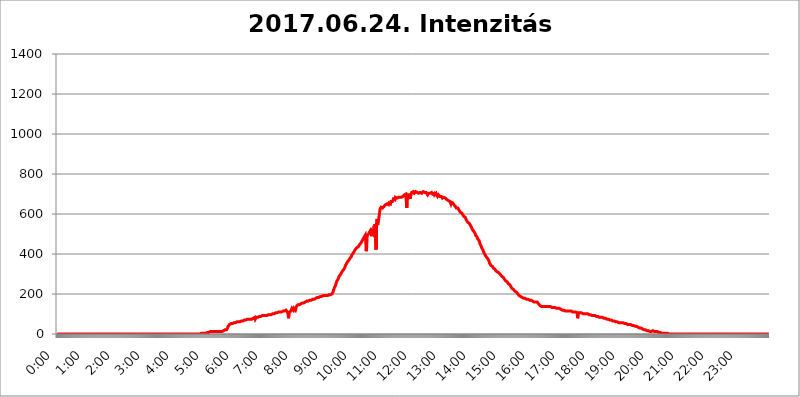
| Category | 2017.06.24. Intenzitás [W/m^2] |
|---|---|
| 0.0 | 0 |
| 0.0006944444444444445 | 0 |
| 0.001388888888888889 | 0 |
| 0.0020833333333333333 | 0 |
| 0.002777777777777778 | 0 |
| 0.003472222222222222 | 0 |
| 0.004166666666666667 | 0 |
| 0.004861111111111111 | 0 |
| 0.005555555555555556 | 0 |
| 0.0062499999999999995 | 0 |
| 0.006944444444444444 | 0 |
| 0.007638888888888889 | 0 |
| 0.008333333333333333 | 0 |
| 0.009027777777777779 | 0 |
| 0.009722222222222222 | 0 |
| 0.010416666666666666 | 0 |
| 0.011111111111111112 | 0 |
| 0.011805555555555555 | 0 |
| 0.012499999999999999 | 0 |
| 0.013194444444444444 | 0 |
| 0.013888888888888888 | 0 |
| 0.014583333333333332 | 0 |
| 0.015277777777777777 | 0 |
| 0.015972222222222224 | 0 |
| 0.016666666666666666 | 0 |
| 0.017361111111111112 | 0 |
| 0.018055555555555557 | 0 |
| 0.01875 | 0 |
| 0.019444444444444445 | 0 |
| 0.02013888888888889 | 0 |
| 0.020833333333333332 | 0 |
| 0.02152777777777778 | 0 |
| 0.022222222222222223 | 0 |
| 0.02291666666666667 | 0 |
| 0.02361111111111111 | 0 |
| 0.024305555555555556 | 0 |
| 0.024999999999999998 | 0 |
| 0.025694444444444447 | 0 |
| 0.02638888888888889 | 0 |
| 0.027083333333333334 | 0 |
| 0.027777777777777776 | 0 |
| 0.02847222222222222 | 0 |
| 0.029166666666666664 | 0 |
| 0.029861111111111113 | 0 |
| 0.030555555555555555 | 0 |
| 0.03125 | 0 |
| 0.03194444444444445 | 0 |
| 0.03263888888888889 | 0 |
| 0.03333333333333333 | 0 |
| 0.034027777777777775 | 0 |
| 0.034722222222222224 | 0 |
| 0.035416666666666666 | 0 |
| 0.036111111111111115 | 0 |
| 0.03680555555555556 | 0 |
| 0.0375 | 0 |
| 0.03819444444444444 | 0 |
| 0.03888888888888889 | 0 |
| 0.03958333333333333 | 0 |
| 0.04027777777777778 | 0 |
| 0.04097222222222222 | 0 |
| 0.041666666666666664 | 0 |
| 0.042361111111111106 | 0 |
| 0.04305555555555556 | 0 |
| 0.043750000000000004 | 0 |
| 0.044444444444444446 | 0 |
| 0.04513888888888889 | 0 |
| 0.04583333333333334 | 0 |
| 0.04652777777777778 | 0 |
| 0.04722222222222222 | 0 |
| 0.04791666666666666 | 0 |
| 0.04861111111111111 | 0 |
| 0.049305555555555554 | 0 |
| 0.049999999999999996 | 0 |
| 0.05069444444444445 | 0 |
| 0.051388888888888894 | 0 |
| 0.052083333333333336 | 0 |
| 0.05277777777777778 | 0 |
| 0.05347222222222222 | 0 |
| 0.05416666666666667 | 0 |
| 0.05486111111111111 | 0 |
| 0.05555555555555555 | 0 |
| 0.05625 | 0 |
| 0.05694444444444444 | 0 |
| 0.057638888888888885 | 0 |
| 0.05833333333333333 | 0 |
| 0.05902777777777778 | 0 |
| 0.059722222222222225 | 0 |
| 0.06041666666666667 | 0 |
| 0.061111111111111116 | 0 |
| 0.06180555555555556 | 0 |
| 0.0625 | 0 |
| 0.06319444444444444 | 0 |
| 0.06388888888888888 | 0 |
| 0.06458333333333334 | 0 |
| 0.06527777777777778 | 0 |
| 0.06597222222222222 | 0 |
| 0.06666666666666667 | 0 |
| 0.06736111111111111 | 0 |
| 0.06805555555555555 | 0 |
| 0.06874999999999999 | 0 |
| 0.06944444444444443 | 0 |
| 0.07013888888888889 | 0 |
| 0.07083333333333333 | 0 |
| 0.07152777777777779 | 0 |
| 0.07222222222222223 | 0 |
| 0.07291666666666667 | 0 |
| 0.07361111111111111 | 0 |
| 0.07430555555555556 | 0 |
| 0.075 | 0 |
| 0.07569444444444444 | 0 |
| 0.0763888888888889 | 0 |
| 0.07708333333333334 | 0 |
| 0.07777777777777778 | 0 |
| 0.07847222222222222 | 0 |
| 0.07916666666666666 | 0 |
| 0.0798611111111111 | 0 |
| 0.08055555555555556 | 0 |
| 0.08125 | 0 |
| 0.08194444444444444 | 0 |
| 0.08263888888888889 | 0 |
| 0.08333333333333333 | 0 |
| 0.08402777777777777 | 0 |
| 0.08472222222222221 | 0 |
| 0.08541666666666665 | 0 |
| 0.08611111111111112 | 0 |
| 0.08680555555555557 | 0 |
| 0.08750000000000001 | 0 |
| 0.08819444444444445 | 0 |
| 0.08888888888888889 | 0 |
| 0.08958333333333333 | 0 |
| 0.09027777777777778 | 0 |
| 0.09097222222222222 | 0 |
| 0.09166666666666667 | 0 |
| 0.09236111111111112 | 0 |
| 0.09305555555555556 | 0 |
| 0.09375 | 0 |
| 0.09444444444444444 | 0 |
| 0.09513888888888888 | 0 |
| 0.09583333333333333 | 0 |
| 0.09652777777777777 | 0 |
| 0.09722222222222222 | 0 |
| 0.09791666666666667 | 0 |
| 0.09861111111111111 | 0 |
| 0.09930555555555555 | 0 |
| 0.09999999999999999 | 0 |
| 0.10069444444444443 | 0 |
| 0.1013888888888889 | 0 |
| 0.10208333333333335 | 0 |
| 0.10277777777777779 | 0 |
| 0.10347222222222223 | 0 |
| 0.10416666666666667 | 0 |
| 0.10486111111111111 | 0 |
| 0.10555555555555556 | 0 |
| 0.10625 | 0 |
| 0.10694444444444444 | 0 |
| 0.1076388888888889 | 0 |
| 0.10833333333333334 | 0 |
| 0.10902777777777778 | 0 |
| 0.10972222222222222 | 0 |
| 0.1111111111111111 | 0 |
| 0.11180555555555556 | 0 |
| 0.11180555555555556 | 0 |
| 0.1125 | 0 |
| 0.11319444444444444 | 0 |
| 0.11388888888888889 | 0 |
| 0.11458333333333333 | 0 |
| 0.11527777777777777 | 0 |
| 0.11597222222222221 | 0 |
| 0.11666666666666665 | 0 |
| 0.1173611111111111 | 0 |
| 0.11805555555555557 | 0 |
| 0.11944444444444445 | 0 |
| 0.12013888888888889 | 0 |
| 0.12083333333333333 | 0 |
| 0.12152777777777778 | 0 |
| 0.12222222222222223 | 0 |
| 0.12291666666666667 | 0 |
| 0.12291666666666667 | 0 |
| 0.12361111111111112 | 0 |
| 0.12430555555555556 | 0 |
| 0.125 | 0 |
| 0.12569444444444444 | 0 |
| 0.12638888888888888 | 0 |
| 0.12708333333333333 | 0 |
| 0.16875 | 0 |
| 0.12847222222222224 | 0 |
| 0.12916666666666668 | 0 |
| 0.12986111111111112 | 0 |
| 0.13055555555555556 | 0 |
| 0.13125 | 0 |
| 0.13194444444444445 | 0 |
| 0.1326388888888889 | 0 |
| 0.13333333333333333 | 0 |
| 0.13402777777777777 | 0 |
| 0.13402777777777777 | 0 |
| 0.13472222222222222 | 0 |
| 0.13541666666666666 | 0 |
| 0.1361111111111111 | 0 |
| 0.13749999999999998 | 0 |
| 0.13819444444444443 | 0 |
| 0.1388888888888889 | 0 |
| 0.13958333333333334 | 0 |
| 0.14027777777777778 | 0 |
| 0.14097222222222222 | 0 |
| 0.14166666666666666 | 0 |
| 0.1423611111111111 | 0 |
| 0.14305555555555557 | 0 |
| 0.14375000000000002 | 0 |
| 0.14444444444444446 | 0 |
| 0.1451388888888889 | 0 |
| 0.1451388888888889 | 0 |
| 0.14652777777777778 | 0 |
| 0.14722222222222223 | 0 |
| 0.14791666666666667 | 0 |
| 0.1486111111111111 | 0 |
| 0.14930555555555555 | 0 |
| 0.15 | 0 |
| 0.15069444444444444 | 0 |
| 0.15138888888888888 | 0 |
| 0.15208333333333332 | 0 |
| 0.15277777777777776 | 0 |
| 0.15347222222222223 | 0 |
| 0.15416666666666667 | 0 |
| 0.15486111111111112 | 0 |
| 0.15555555555555556 | 0 |
| 0.15625 | 0 |
| 0.15694444444444444 | 0 |
| 0.15763888888888888 | 0 |
| 0.15833333333333333 | 0 |
| 0.15902777777777777 | 0 |
| 0.15972222222222224 | 0 |
| 0.16041666666666668 | 0 |
| 0.16111111111111112 | 0 |
| 0.16180555555555556 | 0 |
| 0.1625 | 0 |
| 0.16319444444444445 | 0 |
| 0.1638888888888889 | 0 |
| 0.16458333333333333 | 0 |
| 0.16527777777777777 | 0 |
| 0.16597222222222222 | 0 |
| 0.16666666666666666 | 0 |
| 0.1673611111111111 | 0 |
| 0.16805555555555554 | 0 |
| 0.16874999999999998 | 0 |
| 0.16944444444444443 | 0 |
| 0.17013888888888887 | 0 |
| 0.1708333333333333 | 0 |
| 0.17152777777777775 | 0 |
| 0.17222222222222225 | 0 |
| 0.1729166666666667 | 0 |
| 0.17361111111111113 | 0 |
| 0.17430555555555557 | 0 |
| 0.17500000000000002 | 0 |
| 0.17569444444444446 | 0 |
| 0.1763888888888889 | 0 |
| 0.17708333333333334 | 0 |
| 0.17777777777777778 | 0 |
| 0.17847222222222223 | 0 |
| 0.17916666666666667 | 0 |
| 0.1798611111111111 | 0 |
| 0.18055555555555555 | 0 |
| 0.18125 | 0 |
| 0.18194444444444444 | 0 |
| 0.1826388888888889 | 0 |
| 0.18333333333333335 | 0 |
| 0.1840277777777778 | 0 |
| 0.18472222222222223 | 0 |
| 0.18541666666666667 | 0 |
| 0.18611111111111112 | 0 |
| 0.18680555555555556 | 0 |
| 0.1875 | 0 |
| 0.18819444444444444 | 0 |
| 0.18888888888888888 | 0 |
| 0.18958333333333333 | 0 |
| 0.19027777777777777 | 0 |
| 0.1909722222222222 | 0 |
| 0.19166666666666665 | 0 |
| 0.19236111111111112 | 0 |
| 0.19305555555555554 | 0 |
| 0.19375 | 0 |
| 0.19444444444444445 | 0 |
| 0.1951388888888889 | 0 |
| 0.19583333333333333 | 0 |
| 0.19652777777777777 | 0 |
| 0.19722222222222222 | 0 |
| 0.19791666666666666 | 0 |
| 0.1986111111111111 | 0 |
| 0.19930555555555554 | 0 |
| 0.19999999999999998 | 0 |
| 0.20069444444444443 | 0 |
| 0.20138888888888887 | 0 |
| 0.2020833333333333 | 3.525 |
| 0.2027777777777778 | 3.525 |
| 0.2034722222222222 | 3.525 |
| 0.2041666666666667 | 3.525 |
| 0.20486111111111113 | 3.525 |
| 0.20555555555555557 | 3.525 |
| 0.20625000000000002 | 3.525 |
| 0.20694444444444446 | 3.525 |
| 0.2076388888888889 | 3.525 |
| 0.20833333333333334 | 3.525 |
| 0.20902777777777778 | 3.525 |
| 0.20972222222222223 | 7.887 |
| 0.21041666666666667 | 7.887 |
| 0.2111111111111111 | 7.887 |
| 0.21180555555555555 | 7.887 |
| 0.2125 | 7.887 |
| 0.21319444444444444 | 12.257 |
| 0.2138888888888889 | 12.257 |
| 0.21458333333333335 | 12.257 |
| 0.2152777777777778 | 12.257 |
| 0.21597222222222223 | 7.887 |
| 0.21666666666666667 | 12.257 |
| 0.21736111111111112 | 12.257 |
| 0.21805555555555556 | 12.257 |
| 0.21875 | 12.257 |
| 0.21944444444444444 | 12.257 |
| 0.22013888888888888 | 12.257 |
| 0.22083333333333333 | 12.257 |
| 0.22152777777777777 | 12.257 |
| 0.2222222222222222 | 12.257 |
| 0.22291666666666665 | 12.257 |
| 0.2236111111111111 | 12.257 |
| 0.22430555555555556 | 12.257 |
| 0.225 | 12.257 |
| 0.22569444444444445 | 12.257 |
| 0.2263888888888889 | 12.257 |
| 0.22708333333333333 | 12.257 |
| 0.22777777777777777 | 12.257 |
| 0.22847222222222222 | 12.257 |
| 0.22916666666666666 | 12.257 |
| 0.2298611111111111 | 12.257 |
| 0.23055555555555554 | 12.257 |
| 0.23124999999999998 | 12.257 |
| 0.23194444444444443 | 16.636 |
| 0.23263888888888887 | 16.636 |
| 0.2333333333333333 | 16.636 |
| 0.2340277777777778 | 16.636 |
| 0.2347222222222222 | 16.636 |
| 0.2354166666666667 | 21.024 |
| 0.23611111111111113 | 21.024 |
| 0.23680555555555557 | 21.024 |
| 0.23750000000000002 | 21.024 |
| 0.23819444444444446 | 25.419 |
| 0.2388888888888889 | 29.823 |
| 0.23958333333333334 | 38.653 |
| 0.24027777777777778 | 38.653 |
| 0.24097222222222223 | 43.079 |
| 0.24166666666666667 | 47.511 |
| 0.2423611111111111 | 47.511 |
| 0.24305555555555555 | 47.511 |
| 0.24375 | 51.951 |
| 0.24444444444444446 | 47.511 |
| 0.24513888888888888 | 47.511 |
| 0.24583333333333335 | 51.951 |
| 0.2465277777777778 | 56.398 |
| 0.24722222222222223 | 56.398 |
| 0.24791666666666667 | 56.398 |
| 0.24861111111111112 | 56.398 |
| 0.24930555555555556 | 56.398 |
| 0.25 | 56.398 |
| 0.25069444444444444 | 56.398 |
| 0.2513888888888889 | 56.398 |
| 0.2520833333333333 | 60.85 |
| 0.25277777777777777 | 60.85 |
| 0.2534722222222222 | 60.85 |
| 0.25416666666666665 | 60.85 |
| 0.2548611111111111 | 60.85 |
| 0.2555555555555556 | 60.85 |
| 0.25625000000000003 | 60.85 |
| 0.2569444444444445 | 65.31 |
| 0.2576388888888889 | 65.31 |
| 0.25833333333333336 | 65.31 |
| 0.2590277777777778 | 65.31 |
| 0.25972222222222224 | 65.31 |
| 0.2604166666666667 | 65.31 |
| 0.2611111111111111 | 69.775 |
| 0.26180555555555557 | 69.775 |
| 0.2625 | 69.775 |
| 0.26319444444444445 | 69.775 |
| 0.2638888888888889 | 69.775 |
| 0.26458333333333334 | 69.775 |
| 0.2652777777777778 | 74.246 |
| 0.2659722222222222 | 74.246 |
| 0.26666666666666666 | 74.246 |
| 0.2673611111111111 | 74.246 |
| 0.26805555555555555 | 74.246 |
| 0.26875 | 74.246 |
| 0.26944444444444443 | 74.246 |
| 0.2701388888888889 | 74.246 |
| 0.2708333333333333 | 74.246 |
| 0.27152777777777776 | 74.246 |
| 0.2722222222222222 | 78.722 |
| 0.27291666666666664 | 74.246 |
| 0.2736111111111111 | 78.722 |
| 0.2743055555555555 | 78.722 |
| 0.27499999999999997 | 78.722 |
| 0.27569444444444446 | 78.722 |
| 0.27638888888888885 | 78.722 |
| 0.27708333333333335 | 83.205 |
| 0.2777777777777778 | 74.246 |
| 0.27847222222222223 | 74.246 |
| 0.2791666666666667 | 83.205 |
| 0.2798611111111111 | 83.205 |
| 0.28055555555555556 | 83.205 |
| 0.28125 | 83.205 |
| 0.28194444444444444 | 87.692 |
| 0.2826388888888889 | 87.692 |
| 0.2833333333333333 | 87.692 |
| 0.28402777777777777 | 87.692 |
| 0.2847222222222222 | 87.692 |
| 0.28541666666666665 | 87.692 |
| 0.28611111111111115 | 87.692 |
| 0.28680555555555554 | 92.184 |
| 0.28750000000000003 | 92.184 |
| 0.2881944444444445 | 92.184 |
| 0.2888888888888889 | 92.184 |
| 0.28958333333333336 | 92.184 |
| 0.2902777777777778 | 92.184 |
| 0.29097222222222224 | 92.184 |
| 0.2916666666666667 | 92.184 |
| 0.2923611111111111 | 92.184 |
| 0.29305555555555557 | 92.184 |
| 0.29375 | 92.184 |
| 0.29444444444444445 | 92.184 |
| 0.2951388888888889 | 92.184 |
| 0.29583333333333334 | 96.682 |
| 0.2965277777777778 | 96.682 |
| 0.2972222222222222 | 96.682 |
| 0.29791666666666666 | 96.682 |
| 0.2986111111111111 | 96.682 |
| 0.29930555555555555 | 96.682 |
| 0.3 | 96.682 |
| 0.30069444444444443 | 101.184 |
| 0.3013888888888889 | 101.184 |
| 0.3020833333333333 | 101.184 |
| 0.30277777777777776 | 101.184 |
| 0.3034722222222222 | 101.184 |
| 0.30416666666666664 | 101.184 |
| 0.3048611111111111 | 101.184 |
| 0.3055555555555555 | 101.184 |
| 0.30624999999999997 | 105.69 |
| 0.3069444444444444 | 105.69 |
| 0.3076388888888889 | 105.69 |
| 0.30833333333333335 | 105.69 |
| 0.3090277777777778 | 105.69 |
| 0.30972222222222223 | 105.69 |
| 0.3104166666666667 | 110.201 |
| 0.3111111111111111 | 110.201 |
| 0.31180555555555556 | 110.201 |
| 0.3125 | 110.201 |
| 0.31319444444444444 | 110.201 |
| 0.3138888888888889 | 110.201 |
| 0.3145833333333333 | 110.201 |
| 0.31527777777777777 | 114.716 |
| 0.3159722222222222 | 114.716 |
| 0.31666666666666665 | 114.716 |
| 0.31736111111111115 | 114.716 |
| 0.31805555555555554 | 114.716 |
| 0.31875000000000003 | 114.716 |
| 0.3194444444444445 | 110.201 |
| 0.3201388888888889 | 114.716 |
| 0.32083333333333336 | 119.235 |
| 0.3215277777777778 | 119.235 |
| 0.32222222222222224 | 119.235 |
| 0.3229166666666667 | 110.201 |
| 0.3236111111111111 | 101.184 |
| 0.32430555555555557 | 78.722 |
| 0.325 | 96.682 |
| 0.32569444444444445 | 110.201 |
| 0.3263888888888889 | 110.201 |
| 0.32708333333333334 | 110.201 |
| 0.3277777777777778 | 114.716 |
| 0.3284722222222222 | 119.235 |
| 0.32916666666666666 | 128.284 |
| 0.3298611111111111 | 123.758 |
| 0.33055555555555555 | 128.284 |
| 0.33125 | 119.235 |
| 0.33194444444444443 | 128.284 |
| 0.3326388888888889 | 128.284 |
| 0.3333333333333333 | 132.814 |
| 0.3340277777777778 | 119.235 |
| 0.3347222222222222 | 114.716 |
| 0.3354166666666667 | 137.347 |
| 0.3361111111111111 | 141.884 |
| 0.3368055555555556 | 141.884 |
| 0.33749999999999997 | 146.423 |
| 0.33819444444444446 | 146.423 |
| 0.33888888888888885 | 146.423 |
| 0.33958333333333335 | 146.423 |
| 0.34027777777777773 | 146.423 |
| 0.34097222222222223 | 146.423 |
| 0.3416666666666666 | 150.964 |
| 0.3423611111111111 | 150.964 |
| 0.3430555555555555 | 150.964 |
| 0.34375 | 155.509 |
| 0.3444444444444445 | 155.509 |
| 0.3451388888888889 | 155.509 |
| 0.3458333333333334 | 155.509 |
| 0.34652777777777777 | 155.509 |
| 0.34722222222222227 | 155.509 |
| 0.34791666666666665 | 160.056 |
| 0.34861111111111115 | 160.056 |
| 0.34930555555555554 | 160.056 |
| 0.35000000000000003 | 164.605 |
| 0.3506944444444444 | 164.605 |
| 0.3513888888888889 | 164.605 |
| 0.3520833333333333 | 164.605 |
| 0.3527777777777778 | 164.605 |
| 0.3534722222222222 | 164.605 |
| 0.3541666666666667 | 169.156 |
| 0.3548611111111111 | 169.156 |
| 0.35555555555555557 | 169.156 |
| 0.35625 | 169.156 |
| 0.35694444444444445 | 173.709 |
| 0.3576388888888889 | 173.709 |
| 0.35833333333333334 | 173.709 |
| 0.3590277777777778 | 173.709 |
| 0.3597222222222222 | 173.709 |
| 0.36041666666666666 | 173.709 |
| 0.3611111111111111 | 178.264 |
| 0.36180555555555555 | 178.264 |
| 0.3625 | 178.264 |
| 0.36319444444444443 | 178.264 |
| 0.3638888888888889 | 178.264 |
| 0.3645833333333333 | 182.82 |
| 0.3652777777777778 | 182.82 |
| 0.3659722222222222 | 182.82 |
| 0.3666666666666667 | 182.82 |
| 0.3673611111111111 | 182.82 |
| 0.3680555555555556 | 187.378 |
| 0.36874999999999997 | 187.378 |
| 0.36944444444444446 | 187.378 |
| 0.37013888888888885 | 187.378 |
| 0.37083333333333335 | 187.378 |
| 0.37152777777777773 | 187.378 |
| 0.37222222222222223 | 191.937 |
| 0.3729166666666666 | 191.937 |
| 0.3736111111111111 | 191.937 |
| 0.3743055555555555 | 191.937 |
| 0.375 | 191.937 |
| 0.3756944444444445 | 191.937 |
| 0.3763888888888889 | 191.937 |
| 0.3770833333333334 | 191.937 |
| 0.37777777777777777 | 191.937 |
| 0.37847222222222227 | 191.937 |
| 0.37916666666666665 | 191.937 |
| 0.37986111111111115 | 196.497 |
| 0.38055555555555554 | 196.497 |
| 0.38125000000000003 | 196.497 |
| 0.3819444444444444 | 196.497 |
| 0.3826388888888889 | 196.497 |
| 0.3833333333333333 | 196.497 |
| 0.3840277777777778 | 201.058 |
| 0.3847222222222222 | 201.058 |
| 0.3854166666666667 | 201.058 |
| 0.3861111111111111 | 205.62 |
| 0.38680555555555557 | 210.182 |
| 0.3875 | 219.309 |
| 0.38819444444444445 | 223.873 |
| 0.3888888888888889 | 233 |
| 0.38958333333333334 | 237.564 |
| 0.3902777777777778 | 242.127 |
| 0.3909722222222222 | 251.251 |
| 0.39166666666666666 | 260.373 |
| 0.3923611111111111 | 264.932 |
| 0.39305555555555555 | 269.49 |
| 0.39375 | 274.047 |
| 0.39444444444444443 | 278.603 |
| 0.3951388888888889 | 287.709 |
| 0.3958333333333333 | 287.709 |
| 0.3965277777777778 | 292.259 |
| 0.3972222222222222 | 296.808 |
| 0.3979166666666667 | 301.354 |
| 0.3986111111111111 | 305.898 |
| 0.3993055555555556 | 310.44 |
| 0.39999999999999997 | 314.98 |
| 0.40069444444444446 | 314.98 |
| 0.40138888888888885 | 319.517 |
| 0.40208333333333335 | 324.052 |
| 0.40277777777777773 | 328.584 |
| 0.40347222222222223 | 333.113 |
| 0.4041666666666666 | 342.162 |
| 0.4048611111111111 | 346.682 |
| 0.4055555555555555 | 351.198 |
| 0.40625 | 355.712 |
| 0.4069444444444445 | 360.221 |
| 0.4076388888888889 | 364.728 |
| 0.4083333333333334 | 364.728 |
| 0.40902777777777777 | 369.23 |
| 0.40972222222222227 | 369.23 |
| 0.41041666666666665 | 378.224 |
| 0.41111111111111115 | 378.224 |
| 0.41180555555555554 | 382.715 |
| 0.41250000000000003 | 387.202 |
| 0.4131944444444444 | 396.164 |
| 0.4138888888888889 | 396.164 |
| 0.4145833333333333 | 396.164 |
| 0.4152777777777778 | 405.108 |
| 0.4159722222222222 | 409.574 |
| 0.4166666666666667 | 414.035 |
| 0.4173611111111111 | 414.035 |
| 0.41805555555555557 | 422.943 |
| 0.41875 | 422.943 |
| 0.41944444444444445 | 427.39 |
| 0.4201388888888889 | 431.833 |
| 0.42083333333333334 | 431.833 |
| 0.4215277777777778 | 436.27 |
| 0.4222222222222222 | 436.27 |
| 0.42291666666666666 | 436.27 |
| 0.4236111111111111 | 445.129 |
| 0.42430555555555555 | 449.551 |
| 0.425 | 449.551 |
| 0.42569444444444443 | 453.968 |
| 0.4263888888888889 | 458.38 |
| 0.4270833333333333 | 462.786 |
| 0.4277777777777778 | 467.187 |
| 0.4284722222222222 | 471.582 |
| 0.4291666666666667 | 475.972 |
| 0.4298611111111111 | 480.356 |
| 0.4305555555555556 | 484.735 |
| 0.43124999999999997 | 484.735 |
| 0.43194444444444446 | 493.475 |
| 0.43263888888888885 | 467.187 |
| 0.43333333333333335 | 414.035 |
| 0.43402777777777773 | 436.27 |
| 0.43472222222222223 | 493.475 |
| 0.4354166666666666 | 489.108 |
| 0.4361111111111111 | 497.836 |
| 0.4368055555555555 | 502.192 |
| 0.4375 | 506.542 |
| 0.4381944444444445 | 506.542 |
| 0.4388888888888889 | 515.223 |
| 0.4395833333333334 | 510.885 |
| 0.44027777777777777 | 497.836 |
| 0.44097222222222227 | 489.108 |
| 0.44166666666666665 | 510.885 |
| 0.44236111111111115 | 506.542 |
| 0.44305555555555554 | 502.192 |
| 0.44375000000000003 | 523.88 |
| 0.4444444444444444 | 541.121 |
| 0.4451388888888889 | 528.2 |
| 0.4458333333333333 | 549.704 |
| 0.4465277777777778 | 553.986 |
| 0.4472222222222222 | 422.943 |
| 0.4479166666666667 | 553.986 |
| 0.4486111111111111 | 575.299 |
| 0.44930555555555557 | 545.416 |
| 0.45 | 553.986 |
| 0.45069444444444445 | 558.261 |
| 0.4513888888888889 | 588.009 |
| 0.45208333333333334 | 592.233 |
| 0.4527777777777778 | 625.784 |
| 0.4534722222222222 | 629.948 |
| 0.45416666666666666 | 634.105 |
| 0.4548611111111111 | 634.105 |
| 0.45555555555555555 | 634.105 |
| 0.45625 | 629.948 |
| 0.45694444444444443 | 629.948 |
| 0.4576388888888889 | 634.105 |
| 0.4583333333333333 | 638.256 |
| 0.4590277777777778 | 638.256 |
| 0.4597222222222222 | 642.4 |
| 0.4604166666666667 | 646.537 |
| 0.4611111111111111 | 642.4 |
| 0.4618055555555556 | 646.537 |
| 0.46249999999999997 | 650.667 |
| 0.46319444444444446 | 650.667 |
| 0.46388888888888885 | 650.667 |
| 0.46458333333333335 | 646.537 |
| 0.46527777777777773 | 654.791 |
| 0.46597222222222223 | 654.791 |
| 0.4666666666666666 | 654.791 |
| 0.4673611111111111 | 650.667 |
| 0.4680555555555555 | 663.019 |
| 0.46875 | 658.909 |
| 0.4694444444444445 | 663.019 |
| 0.4701388888888889 | 663.019 |
| 0.4708333333333334 | 663.019 |
| 0.47152777777777777 | 675.311 |
| 0.47222222222222227 | 671.22 |
| 0.47291666666666665 | 679.395 |
| 0.47361111111111115 | 671.22 |
| 0.47430555555555554 | 683.473 |
| 0.47500000000000003 | 683.473 |
| 0.4756944444444444 | 683.473 |
| 0.4763888888888889 | 679.395 |
| 0.4770833333333333 | 683.473 |
| 0.4777777777777778 | 683.473 |
| 0.4784722222222222 | 683.473 |
| 0.4791666666666667 | 683.473 |
| 0.4798611111111111 | 687.544 |
| 0.48055555555555557 | 683.473 |
| 0.48125 | 687.544 |
| 0.48194444444444445 | 687.544 |
| 0.4826388888888889 | 683.473 |
| 0.48333333333333334 | 687.544 |
| 0.4840277777777778 | 687.544 |
| 0.4847222222222222 | 687.544 |
| 0.48541666666666666 | 683.473 |
| 0.4861111111111111 | 683.473 |
| 0.48680555555555555 | 695.666 |
| 0.4875 | 695.666 |
| 0.48819444444444443 | 695.666 |
| 0.4888888888888889 | 699.717 |
| 0.4895833333333333 | 663.019 |
| 0.4902777777777778 | 629.948 |
| 0.4909722222222222 | 695.666 |
| 0.4916666666666667 | 695.666 |
| 0.4923611111111111 | 691.608 |
| 0.4930555555555556 | 695.666 |
| 0.49374999999999997 | 695.666 |
| 0.49444444444444446 | 695.666 |
| 0.49513888888888885 | 675.311 |
| 0.49583333333333335 | 695.666 |
| 0.49652777777777773 | 695.666 |
| 0.49722222222222223 | 707.8 |
| 0.4979166666666666 | 703.762 |
| 0.4986111111111111 | 707.8 |
| 0.4993055555555555 | 711.832 |
| 0.5 | 707.8 |
| 0.5006944444444444 | 703.762 |
| 0.5013888888888889 | 703.762 |
| 0.5020833333333333 | 703.762 |
| 0.5027777777777778 | 711.832 |
| 0.5034722222222222 | 711.832 |
| 0.5041666666666667 | 711.832 |
| 0.5048611111111111 | 707.8 |
| 0.5055555555555555 | 707.8 |
| 0.50625 | 703.762 |
| 0.5069444444444444 | 703.762 |
| 0.5076388888888889 | 703.762 |
| 0.5083333333333333 | 703.762 |
| 0.5090277777777777 | 707.8 |
| 0.5097222222222222 | 703.762 |
| 0.5104166666666666 | 707.8 |
| 0.5111111111111112 | 703.762 |
| 0.5118055555555555 | 707.8 |
| 0.5125000000000001 | 707.8 |
| 0.5131944444444444 | 711.832 |
| 0.513888888888889 | 711.832 |
| 0.5145833333333333 | 711.832 |
| 0.5152777777777778 | 707.8 |
| 0.5159722222222222 | 703.762 |
| 0.5166666666666667 | 707.8 |
| 0.517361111111111 | 707.8 |
| 0.5180555555555556 | 703.762 |
| 0.5187499999999999 | 703.762 |
| 0.5194444444444445 | 695.666 |
| 0.5201388888888888 | 695.666 |
| 0.5208333333333334 | 703.762 |
| 0.5215277777777778 | 707.8 |
| 0.5222222222222223 | 707.8 |
| 0.5229166666666667 | 703.762 |
| 0.5236111111111111 | 707.8 |
| 0.5243055555555556 | 703.762 |
| 0.525 | 707.8 |
| 0.5256944444444445 | 703.762 |
| 0.5263888888888889 | 699.717 |
| 0.5270833333333333 | 695.666 |
| 0.5277777777777778 | 699.717 |
| 0.5284722222222222 | 703.762 |
| 0.5291666666666667 | 695.666 |
| 0.5298611111111111 | 691.608 |
| 0.5305555555555556 | 699.717 |
| 0.53125 | 703.762 |
| 0.5319444444444444 | 695.666 |
| 0.5326388888888889 | 695.666 |
| 0.5333333333333333 | 687.544 |
| 0.5340277777777778 | 691.608 |
| 0.5347222222222222 | 695.666 |
| 0.5354166666666667 | 695.666 |
| 0.5361111111111111 | 691.608 |
| 0.5368055555555555 | 687.544 |
| 0.5375 | 683.473 |
| 0.5381944444444444 | 687.544 |
| 0.5388888888888889 | 687.544 |
| 0.5395833333333333 | 687.544 |
| 0.5402777777777777 | 679.395 |
| 0.5409722222222222 | 683.473 |
| 0.5416666666666666 | 679.395 |
| 0.5423611111111112 | 683.473 |
| 0.5430555555555555 | 679.395 |
| 0.5437500000000001 | 679.395 |
| 0.5444444444444444 | 679.395 |
| 0.545138888888889 | 675.311 |
| 0.5458333333333333 | 675.311 |
| 0.5465277777777778 | 671.22 |
| 0.5472222222222222 | 671.22 |
| 0.5479166666666667 | 667.123 |
| 0.548611111111111 | 667.123 |
| 0.5493055555555556 | 667.123 |
| 0.5499999999999999 | 667.123 |
| 0.5506944444444445 | 663.019 |
| 0.5513888888888888 | 658.909 |
| 0.5520833333333334 | 650.667 |
| 0.5527777777777778 | 658.909 |
| 0.5534722222222223 | 658.909 |
| 0.5541666666666667 | 654.791 |
| 0.5548611111111111 | 654.791 |
| 0.5555555555555556 | 650.667 |
| 0.55625 | 646.537 |
| 0.5569444444444445 | 646.537 |
| 0.5576388888888889 | 642.4 |
| 0.5583333333333333 | 638.256 |
| 0.5590277777777778 | 634.105 |
| 0.5597222222222222 | 629.948 |
| 0.5604166666666667 | 629.948 |
| 0.5611111111111111 | 629.948 |
| 0.5618055555555556 | 629.948 |
| 0.5625 | 629.948 |
| 0.5631944444444444 | 625.784 |
| 0.5638888888888889 | 617.436 |
| 0.5645833333333333 | 613.252 |
| 0.5652777777777778 | 609.062 |
| 0.5659722222222222 | 604.864 |
| 0.5666666666666667 | 604.864 |
| 0.5673611111111111 | 604.864 |
| 0.5680555555555555 | 604.864 |
| 0.56875 | 596.45 |
| 0.5694444444444444 | 592.233 |
| 0.5701388888888889 | 588.009 |
| 0.5708333333333333 | 592.233 |
| 0.5715277777777777 | 583.779 |
| 0.5722222222222222 | 583.779 |
| 0.5729166666666666 | 579.542 |
| 0.5736111111111112 | 571.049 |
| 0.5743055555555555 | 571.049 |
| 0.5750000000000001 | 566.793 |
| 0.5756944444444444 | 558.261 |
| 0.576388888888889 | 562.53 |
| 0.5770833333333333 | 553.986 |
| 0.5777777777777778 | 553.986 |
| 0.5784722222222222 | 553.986 |
| 0.5791666666666667 | 545.416 |
| 0.579861111111111 | 541.121 |
| 0.5805555555555556 | 536.82 |
| 0.5812499999999999 | 536.82 |
| 0.5819444444444445 | 532.513 |
| 0.5826388888888888 | 519.555 |
| 0.5833333333333334 | 515.223 |
| 0.5840277777777778 | 515.223 |
| 0.5847222222222223 | 510.885 |
| 0.5854166666666667 | 506.542 |
| 0.5861111111111111 | 502.192 |
| 0.5868055555555556 | 493.475 |
| 0.5875 | 493.475 |
| 0.5881944444444445 | 489.108 |
| 0.5888888888888889 | 484.735 |
| 0.5895833333333333 | 475.972 |
| 0.5902777777777778 | 475.972 |
| 0.5909722222222222 | 471.582 |
| 0.5916666666666667 | 467.187 |
| 0.5923611111111111 | 462.786 |
| 0.5930555555555556 | 449.551 |
| 0.59375 | 445.129 |
| 0.5944444444444444 | 440.702 |
| 0.5951388888888889 | 431.833 |
| 0.5958333333333333 | 427.39 |
| 0.5965277777777778 | 427.39 |
| 0.5972222222222222 | 418.492 |
| 0.5979166666666667 | 414.035 |
| 0.5986111111111111 | 405.108 |
| 0.5993055555555555 | 400.638 |
| 0.6 | 396.164 |
| 0.6006944444444444 | 391.685 |
| 0.6013888888888889 | 387.202 |
| 0.6020833333333333 | 387.202 |
| 0.6027777777777777 | 387.202 |
| 0.6034722222222222 | 378.224 |
| 0.6041666666666666 | 378.224 |
| 0.6048611111111112 | 373.729 |
| 0.6055555555555555 | 364.728 |
| 0.6062500000000001 | 355.712 |
| 0.6069444444444444 | 351.198 |
| 0.607638888888889 | 351.198 |
| 0.6083333333333333 | 342.162 |
| 0.6090277777777778 | 342.162 |
| 0.6097222222222222 | 342.162 |
| 0.6104166666666667 | 337.639 |
| 0.611111111111111 | 333.113 |
| 0.6118055555555556 | 328.584 |
| 0.6124999999999999 | 328.584 |
| 0.6131944444444445 | 324.052 |
| 0.6138888888888888 | 324.052 |
| 0.6145833333333334 | 319.517 |
| 0.6152777777777778 | 314.98 |
| 0.6159722222222223 | 314.98 |
| 0.6166666666666667 | 310.44 |
| 0.6173611111111111 | 310.44 |
| 0.6180555555555556 | 310.44 |
| 0.61875 | 305.898 |
| 0.6194444444444445 | 305.898 |
| 0.6201388888888889 | 301.354 |
| 0.6208333333333333 | 301.354 |
| 0.6215277777777778 | 296.808 |
| 0.6222222222222222 | 296.808 |
| 0.6229166666666667 | 292.259 |
| 0.6236111111111111 | 287.709 |
| 0.6243055555555556 | 287.709 |
| 0.625 | 283.156 |
| 0.6256944444444444 | 283.156 |
| 0.6263888888888889 | 278.603 |
| 0.6270833333333333 | 274.047 |
| 0.6277777777777778 | 269.49 |
| 0.6284722222222222 | 269.49 |
| 0.6291666666666667 | 264.932 |
| 0.6298611111111111 | 260.373 |
| 0.6305555555555555 | 260.373 |
| 0.63125 | 260.373 |
| 0.6319444444444444 | 255.813 |
| 0.6326388888888889 | 251.251 |
| 0.6333333333333333 | 251.251 |
| 0.6340277777777777 | 246.689 |
| 0.6347222222222222 | 246.689 |
| 0.6354166666666666 | 242.127 |
| 0.6361111111111112 | 237.564 |
| 0.6368055555555555 | 233 |
| 0.6375000000000001 | 228.436 |
| 0.6381944444444444 | 228.436 |
| 0.638888888888889 | 228.436 |
| 0.6395833333333333 | 223.873 |
| 0.6402777777777778 | 219.309 |
| 0.6409722222222222 | 219.309 |
| 0.6416666666666667 | 214.746 |
| 0.642361111111111 | 214.746 |
| 0.6430555555555556 | 210.182 |
| 0.6437499999999999 | 210.182 |
| 0.6444444444444445 | 205.62 |
| 0.6451388888888888 | 205.62 |
| 0.6458333333333334 | 201.058 |
| 0.6465277777777778 | 201.058 |
| 0.6472222222222223 | 196.497 |
| 0.6479166666666667 | 191.937 |
| 0.6486111111111111 | 191.937 |
| 0.6493055555555556 | 191.937 |
| 0.65 | 187.378 |
| 0.6506944444444445 | 187.378 |
| 0.6513888888888889 | 187.378 |
| 0.6520833333333333 | 182.82 |
| 0.6527777777777778 | 182.82 |
| 0.6534722222222222 | 182.82 |
| 0.6541666666666667 | 178.264 |
| 0.6548611111111111 | 178.264 |
| 0.6555555555555556 | 178.264 |
| 0.65625 | 178.264 |
| 0.6569444444444444 | 178.264 |
| 0.6576388888888889 | 173.709 |
| 0.6583333333333333 | 173.709 |
| 0.6590277777777778 | 173.709 |
| 0.6597222222222222 | 173.709 |
| 0.6604166666666667 | 173.709 |
| 0.6611111111111111 | 173.709 |
| 0.6618055555555555 | 173.709 |
| 0.6625 | 169.156 |
| 0.6631944444444444 | 169.156 |
| 0.6638888888888889 | 169.156 |
| 0.6645833333333333 | 169.156 |
| 0.6652777777777777 | 169.156 |
| 0.6659722222222222 | 164.605 |
| 0.6666666666666666 | 164.605 |
| 0.6673611111111111 | 164.605 |
| 0.6680555555555556 | 164.605 |
| 0.6687500000000001 | 160.056 |
| 0.6694444444444444 | 160.056 |
| 0.6701388888888888 | 160.056 |
| 0.6708333333333334 | 160.056 |
| 0.6715277777777778 | 160.056 |
| 0.6722222222222222 | 160.056 |
| 0.6729166666666666 | 160.056 |
| 0.6736111111111112 | 155.509 |
| 0.6743055555555556 | 155.509 |
| 0.6749999999999999 | 150.964 |
| 0.6756944444444444 | 146.423 |
| 0.6763888888888889 | 146.423 |
| 0.6770833333333334 | 141.884 |
| 0.6777777777777777 | 141.884 |
| 0.6784722222222223 | 141.884 |
| 0.6791666666666667 | 137.347 |
| 0.6798611111111111 | 137.347 |
| 0.6805555555555555 | 137.347 |
| 0.68125 | 137.347 |
| 0.6819444444444445 | 137.347 |
| 0.6826388888888889 | 137.347 |
| 0.6833333333333332 | 137.347 |
| 0.6840277777777778 | 137.347 |
| 0.6847222222222222 | 137.347 |
| 0.6854166666666667 | 137.347 |
| 0.686111111111111 | 137.347 |
| 0.6868055555555556 | 137.347 |
| 0.6875 | 137.347 |
| 0.6881944444444444 | 137.347 |
| 0.688888888888889 | 137.347 |
| 0.6895833333333333 | 137.347 |
| 0.6902777777777778 | 137.347 |
| 0.6909722222222222 | 137.347 |
| 0.6916666666666668 | 137.347 |
| 0.6923611111111111 | 132.814 |
| 0.6930555555555555 | 132.814 |
| 0.69375 | 132.814 |
| 0.6944444444444445 | 132.814 |
| 0.6951388888888889 | 132.814 |
| 0.6958333333333333 | 132.814 |
| 0.6965277777777777 | 132.814 |
| 0.6972222222222223 | 132.814 |
| 0.6979166666666666 | 132.814 |
| 0.6986111111111111 | 128.284 |
| 0.6993055555555556 | 128.284 |
| 0.7000000000000001 | 128.284 |
| 0.7006944444444444 | 128.284 |
| 0.7013888888888888 | 128.284 |
| 0.7020833333333334 | 128.284 |
| 0.7027777777777778 | 128.284 |
| 0.7034722222222222 | 128.284 |
| 0.7041666666666666 | 128.284 |
| 0.7048611111111112 | 123.758 |
| 0.7055555555555556 | 123.758 |
| 0.7062499999999999 | 123.758 |
| 0.7069444444444444 | 123.758 |
| 0.7076388888888889 | 123.758 |
| 0.7083333333333334 | 119.235 |
| 0.7090277777777777 | 119.235 |
| 0.7097222222222223 | 119.235 |
| 0.7104166666666667 | 119.235 |
| 0.7111111111111111 | 119.235 |
| 0.7118055555555555 | 114.716 |
| 0.7125 | 114.716 |
| 0.7131944444444445 | 114.716 |
| 0.7138888888888889 | 114.716 |
| 0.7145833333333332 | 114.716 |
| 0.7152777777777778 | 114.716 |
| 0.7159722222222222 | 114.716 |
| 0.7166666666666667 | 114.716 |
| 0.717361111111111 | 114.716 |
| 0.7180555555555556 | 114.716 |
| 0.71875 | 114.716 |
| 0.7194444444444444 | 114.716 |
| 0.720138888888889 | 114.716 |
| 0.7208333333333333 | 114.716 |
| 0.7215277777777778 | 114.716 |
| 0.7222222222222222 | 114.716 |
| 0.7229166666666668 | 110.201 |
| 0.7236111111111111 | 110.201 |
| 0.7243055555555555 | 110.201 |
| 0.725 | 110.201 |
| 0.7256944444444445 | 110.201 |
| 0.7263888888888889 | 110.201 |
| 0.7270833333333333 | 110.201 |
| 0.7277777777777777 | 110.201 |
| 0.7284722222222223 | 110.201 |
| 0.7291666666666666 | 105.69 |
| 0.7298611111111111 | 78.722 |
| 0.7305555555555556 | 96.682 |
| 0.7312500000000001 | 105.69 |
| 0.7319444444444444 | 110.201 |
| 0.7326388888888888 | 105.69 |
| 0.7333333333333334 | 105.69 |
| 0.7340277777777778 | 105.69 |
| 0.7347222222222222 | 105.69 |
| 0.7354166666666666 | 105.69 |
| 0.7361111111111112 | 105.69 |
| 0.7368055555555556 | 101.184 |
| 0.7374999999999999 | 101.184 |
| 0.7381944444444444 | 101.184 |
| 0.7388888888888889 | 101.184 |
| 0.7395833333333334 | 101.184 |
| 0.7402777777777777 | 101.184 |
| 0.7409722222222223 | 101.184 |
| 0.7416666666666667 | 101.184 |
| 0.7423611111111111 | 101.184 |
| 0.7430555555555555 | 101.184 |
| 0.74375 | 101.184 |
| 0.7444444444444445 | 101.184 |
| 0.7451388888888889 | 101.184 |
| 0.7458333333333332 | 96.682 |
| 0.7465277777777778 | 96.682 |
| 0.7472222222222222 | 96.682 |
| 0.7479166666666667 | 96.682 |
| 0.748611111111111 | 96.682 |
| 0.7493055555555556 | 96.682 |
| 0.75 | 92.184 |
| 0.7506944444444444 | 92.184 |
| 0.751388888888889 | 92.184 |
| 0.7520833333333333 | 92.184 |
| 0.7527777777777778 | 92.184 |
| 0.7534722222222222 | 92.184 |
| 0.7541666666666668 | 92.184 |
| 0.7548611111111111 | 87.692 |
| 0.7555555555555555 | 87.692 |
| 0.75625 | 87.692 |
| 0.7569444444444445 | 87.692 |
| 0.7576388888888889 | 87.692 |
| 0.7583333333333333 | 87.692 |
| 0.7590277777777777 | 87.692 |
| 0.7597222222222223 | 83.205 |
| 0.7604166666666666 | 83.205 |
| 0.7611111111111111 | 83.205 |
| 0.7618055555555556 | 83.205 |
| 0.7625000000000001 | 83.205 |
| 0.7631944444444444 | 83.205 |
| 0.7638888888888888 | 83.205 |
| 0.7645833333333334 | 83.205 |
| 0.7652777777777778 | 78.722 |
| 0.7659722222222222 | 78.722 |
| 0.7666666666666666 | 78.722 |
| 0.7673611111111112 | 78.722 |
| 0.7680555555555556 | 78.722 |
| 0.7687499999999999 | 78.722 |
| 0.7694444444444444 | 74.246 |
| 0.7701388888888889 | 74.246 |
| 0.7708333333333334 | 74.246 |
| 0.7715277777777777 | 74.246 |
| 0.7722222222222223 | 74.246 |
| 0.7729166666666667 | 74.246 |
| 0.7736111111111111 | 69.775 |
| 0.7743055555555555 | 69.775 |
| 0.775 | 69.775 |
| 0.7756944444444445 | 69.775 |
| 0.7763888888888889 | 69.775 |
| 0.7770833333333332 | 69.775 |
| 0.7777777777777778 | 69.775 |
| 0.7784722222222222 | 69.775 |
| 0.7791666666666667 | 65.31 |
| 0.779861111111111 | 65.31 |
| 0.7805555555555556 | 65.31 |
| 0.78125 | 65.31 |
| 0.7819444444444444 | 65.31 |
| 0.782638888888889 | 65.31 |
| 0.7833333333333333 | 60.85 |
| 0.7840277777777778 | 60.85 |
| 0.7847222222222222 | 60.85 |
| 0.7854166666666668 | 60.85 |
| 0.7861111111111111 | 60.85 |
| 0.7868055555555555 | 60.85 |
| 0.7875 | 56.398 |
| 0.7881944444444445 | 56.398 |
| 0.7888888888888889 | 56.398 |
| 0.7895833333333333 | 56.398 |
| 0.7902777777777777 | 56.398 |
| 0.7909722222222223 | 56.398 |
| 0.7916666666666666 | 56.398 |
| 0.7923611111111111 | 56.398 |
| 0.7930555555555556 | 56.398 |
| 0.7937500000000001 | 56.398 |
| 0.7944444444444444 | 51.951 |
| 0.7951388888888888 | 51.951 |
| 0.7958333333333334 | 51.951 |
| 0.7965277777777778 | 51.951 |
| 0.7972222222222222 | 51.951 |
| 0.7979166666666666 | 51.951 |
| 0.7986111111111112 | 51.951 |
| 0.7993055555555556 | 47.511 |
| 0.7999999999999999 | 47.511 |
| 0.8006944444444444 | 47.511 |
| 0.8013888888888889 | 47.511 |
| 0.8020833333333334 | 47.511 |
| 0.8027777777777777 | 47.511 |
| 0.8034722222222223 | 47.511 |
| 0.8041666666666667 | 47.511 |
| 0.8048611111111111 | 43.079 |
| 0.8055555555555555 | 43.079 |
| 0.80625 | 43.079 |
| 0.8069444444444445 | 43.079 |
| 0.8076388888888889 | 43.079 |
| 0.8083333333333332 | 43.079 |
| 0.8090277777777778 | 38.653 |
| 0.8097222222222222 | 38.653 |
| 0.8104166666666667 | 38.653 |
| 0.811111111111111 | 38.653 |
| 0.8118055555555556 | 38.653 |
| 0.8125 | 38.653 |
| 0.8131944444444444 | 34.234 |
| 0.813888888888889 | 34.234 |
| 0.8145833333333333 | 34.234 |
| 0.8152777777777778 | 34.234 |
| 0.8159722222222222 | 34.234 |
| 0.8166666666666668 | 29.823 |
| 0.8173611111111111 | 29.823 |
| 0.8180555555555555 | 29.823 |
| 0.81875 | 29.823 |
| 0.8194444444444445 | 29.823 |
| 0.8201388888888889 | 25.419 |
| 0.8208333333333333 | 25.419 |
| 0.8215277777777777 | 21.024 |
| 0.8222222222222223 | 21.024 |
| 0.8229166666666666 | 21.024 |
| 0.8236111111111111 | 21.024 |
| 0.8243055555555556 | 21.024 |
| 0.8250000000000001 | 21.024 |
| 0.8256944444444444 | 16.636 |
| 0.8263888888888888 | 16.636 |
| 0.8270833333333334 | 16.636 |
| 0.8277777777777778 | 16.636 |
| 0.8284722222222222 | 16.636 |
| 0.8291666666666666 | 16.636 |
| 0.8298611111111112 | 16.636 |
| 0.8305555555555556 | 16.636 |
| 0.8312499999999999 | 12.257 |
| 0.8319444444444444 | 12.257 |
| 0.8326388888888889 | 16.636 |
| 0.8333333333333334 | 12.257 |
| 0.8340277777777777 | 12.257 |
| 0.8347222222222223 | 12.257 |
| 0.8354166666666667 | 16.636 |
| 0.8361111111111111 | 12.257 |
| 0.8368055555555555 | 12.257 |
| 0.8375 | 12.257 |
| 0.8381944444444445 | 12.257 |
| 0.8388888888888889 | 12.257 |
| 0.8395833333333332 | 12.257 |
| 0.8402777777777778 | 12.257 |
| 0.8409722222222222 | 12.257 |
| 0.8416666666666667 | 12.257 |
| 0.842361111111111 | 7.887 |
| 0.8430555555555556 | 7.887 |
| 0.84375 | 7.887 |
| 0.8444444444444444 | 7.887 |
| 0.845138888888889 | 7.887 |
| 0.8458333333333333 | 7.887 |
| 0.8465277777777778 | 3.525 |
| 0.8472222222222222 | 3.525 |
| 0.8479166666666668 | 3.525 |
| 0.8486111111111111 | 3.525 |
| 0.8493055555555555 | 3.525 |
| 0.85 | 3.525 |
| 0.8506944444444445 | 3.525 |
| 0.8513888888888889 | 3.525 |
| 0.8520833333333333 | 3.525 |
| 0.8527777777777777 | 3.525 |
| 0.8534722222222223 | 3.525 |
| 0.8541666666666666 | 3.525 |
| 0.8548611111111111 | 3.525 |
| 0.8555555555555556 | 3.525 |
| 0.8562500000000001 | 3.525 |
| 0.8569444444444444 | 0 |
| 0.8576388888888888 | 0 |
| 0.8583333333333334 | 0 |
| 0.8590277777777778 | 0 |
| 0.8597222222222222 | 0 |
| 0.8604166666666666 | 0 |
| 0.8611111111111112 | 0 |
| 0.8618055555555556 | 0 |
| 0.8624999999999999 | 0 |
| 0.8631944444444444 | 0 |
| 0.8638888888888889 | 0 |
| 0.8645833333333334 | 0 |
| 0.8652777777777777 | 0 |
| 0.8659722222222223 | 0 |
| 0.8666666666666667 | 0 |
| 0.8673611111111111 | 0 |
| 0.8680555555555555 | 0 |
| 0.86875 | 0 |
| 0.8694444444444445 | 0 |
| 0.8701388888888889 | 0 |
| 0.8708333333333332 | 0 |
| 0.8715277777777778 | 0 |
| 0.8722222222222222 | 0 |
| 0.8729166666666667 | 0 |
| 0.873611111111111 | 0 |
| 0.8743055555555556 | 0 |
| 0.875 | 0 |
| 0.8756944444444444 | 0 |
| 0.876388888888889 | 0 |
| 0.8770833333333333 | 0 |
| 0.8777777777777778 | 0 |
| 0.8784722222222222 | 0 |
| 0.8791666666666668 | 0 |
| 0.8798611111111111 | 0 |
| 0.8805555555555555 | 0 |
| 0.88125 | 0 |
| 0.8819444444444445 | 0 |
| 0.8826388888888889 | 0 |
| 0.8833333333333333 | 0 |
| 0.8840277777777777 | 0 |
| 0.8847222222222223 | 0 |
| 0.8854166666666666 | 0 |
| 0.8861111111111111 | 0 |
| 0.8868055555555556 | 0 |
| 0.8875000000000001 | 0 |
| 0.8881944444444444 | 0 |
| 0.8888888888888888 | 0 |
| 0.8895833333333334 | 0 |
| 0.8902777777777778 | 0 |
| 0.8909722222222222 | 0 |
| 0.8916666666666666 | 0 |
| 0.8923611111111112 | 0 |
| 0.8930555555555556 | 0 |
| 0.8937499999999999 | 0 |
| 0.8944444444444444 | 0 |
| 0.8951388888888889 | 0 |
| 0.8958333333333334 | 0 |
| 0.8965277777777777 | 0 |
| 0.8972222222222223 | 0 |
| 0.8979166666666667 | 0 |
| 0.8986111111111111 | 0 |
| 0.8993055555555555 | 0 |
| 0.9 | 0 |
| 0.9006944444444445 | 0 |
| 0.9013888888888889 | 0 |
| 0.9020833333333332 | 0 |
| 0.9027777777777778 | 0 |
| 0.9034722222222222 | 0 |
| 0.9041666666666667 | 0 |
| 0.904861111111111 | 0 |
| 0.9055555555555556 | 0 |
| 0.90625 | 0 |
| 0.9069444444444444 | 0 |
| 0.907638888888889 | 0 |
| 0.9083333333333333 | 0 |
| 0.9090277777777778 | 0 |
| 0.9097222222222222 | 0 |
| 0.9104166666666668 | 0 |
| 0.9111111111111111 | 0 |
| 0.9118055555555555 | 0 |
| 0.9125 | 0 |
| 0.9131944444444445 | 0 |
| 0.9138888888888889 | 0 |
| 0.9145833333333333 | 0 |
| 0.9152777777777777 | 0 |
| 0.9159722222222223 | 0 |
| 0.9166666666666666 | 0 |
| 0.9173611111111111 | 0 |
| 0.9180555555555556 | 0 |
| 0.9187500000000001 | 0 |
| 0.9194444444444444 | 0 |
| 0.9201388888888888 | 0 |
| 0.9208333333333334 | 0 |
| 0.9215277777777778 | 0 |
| 0.9222222222222222 | 0 |
| 0.9229166666666666 | 0 |
| 0.9236111111111112 | 0 |
| 0.9243055555555556 | 0 |
| 0.9249999999999999 | 0 |
| 0.9256944444444444 | 0 |
| 0.9263888888888889 | 0 |
| 0.9270833333333334 | 0 |
| 0.9277777777777777 | 0 |
| 0.9284722222222223 | 0 |
| 0.9291666666666667 | 0 |
| 0.9298611111111111 | 0 |
| 0.9305555555555555 | 0 |
| 0.93125 | 0 |
| 0.9319444444444445 | 0 |
| 0.9326388888888889 | 0 |
| 0.9333333333333332 | 0 |
| 0.9340277777777778 | 0 |
| 0.9347222222222222 | 0 |
| 0.9354166666666667 | 0 |
| 0.936111111111111 | 0 |
| 0.9368055555555556 | 0 |
| 0.9375 | 0 |
| 0.9381944444444444 | 0 |
| 0.938888888888889 | 0 |
| 0.9395833333333333 | 0 |
| 0.9402777777777778 | 0 |
| 0.9409722222222222 | 0 |
| 0.9416666666666668 | 0 |
| 0.9423611111111111 | 0 |
| 0.9430555555555555 | 0 |
| 0.94375 | 0 |
| 0.9444444444444445 | 0 |
| 0.9451388888888889 | 0 |
| 0.9458333333333333 | 0 |
| 0.9465277777777777 | 0 |
| 0.9472222222222223 | 0 |
| 0.9479166666666666 | 0 |
| 0.9486111111111111 | 0 |
| 0.9493055555555556 | 0 |
| 0.9500000000000001 | 0 |
| 0.9506944444444444 | 0 |
| 0.9513888888888888 | 0 |
| 0.9520833333333334 | 0 |
| 0.9527777777777778 | 0 |
| 0.9534722222222222 | 0 |
| 0.9541666666666666 | 0 |
| 0.9548611111111112 | 0 |
| 0.9555555555555556 | 0 |
| 0.9562499999999999 | 0 |
| 0.9569444444444444 | 0 |
| 0.9576388888888889 | 0 |
| 0.9583333333333334 | 0 |
| 0.9590277777777777 | 0 |
| 0.9597222222222223 | 0 |
| 0.9604166666666667 | 0 |
| 0.9611111111111111 | 0 |
| 0.9618055555555555 | 0 |
| 0.9625 | 0 |
| 0.9631944444444445 | 0 |
| 0.9638888888888889 | 0 |
| 0.9645833333333332 | 0 |
| 0.9652777777777778 | 0 |
| 0.9659722222222222 | 0 |
| 0.9666666666666667 | 0 |
| 0.967361111111111 | 0 |
| 0.9680555555555556 | 0 |
| 0.96875 | 0 |
| 0.9694444444444444 | 0 |
| 0.970138888888889 | 0 |
| 0.9708333333333333 | 0 |
| 0.9715277777777778 | 0 |
| 0.9722222222222222 | 0 |
| 0.9729166666666668 | 0 |
| 0.9736111111111111 | 0 |
| 0.9743055555555555 | 0 |
| 0.975 | 0 |
| 0.9756944444444445 | 0 |
| 0.9763888888888889 | 0 |
| 0.9770833333333333 | 0 |
| 0.9777777777777777 | 0 |
| 0.9784722222222223 | 0 |
| 0.9791666666666666 | 0 |
| 0.9798611111111111 | 0 |
| 0.9805555555555556 | 0 |
| 0.9812500000000001 | 0 |
| 0.9819444444444444 | 0 |
| 0.9826388888888888 | 0 |
| 0.9833333333333334 | 0 |
| 0.9840277777777778 | 0 |
| 0.9847222222222222 | 0 |
| 0.9854166666666666 | 0 |
| 0.9861111111111112 | 0 |
| 0.9868055555555556 | 0 |
| 0.9874999999999999 | 0 |
| 0.9881944444444444 | 0 |
| 0.9888888888888889 | 0 |
| 0.9895833333333334 | 0 |
| 0.9902777777777777 | 0 |
| 0.9909722222222223 | 0 |
| 0.9916666666666667 | 0 |
| 0.9923611111111111 | 0 |
| 0.9930555555555555 | 0 |
| 0.99375 | 0 |
| 0.9944444444444445 | 0 |
| 0.9951388888888889 | 0 |
| 0.9958333333333332 | 0 |
| 0.9965277777777778 | 0 |
| 0.9972222222222222 | 0 |
| 0.9979166666666667 | 0 |
| 0.998611111111111 | 0 |
| 0.9993055555555556 | 0 |